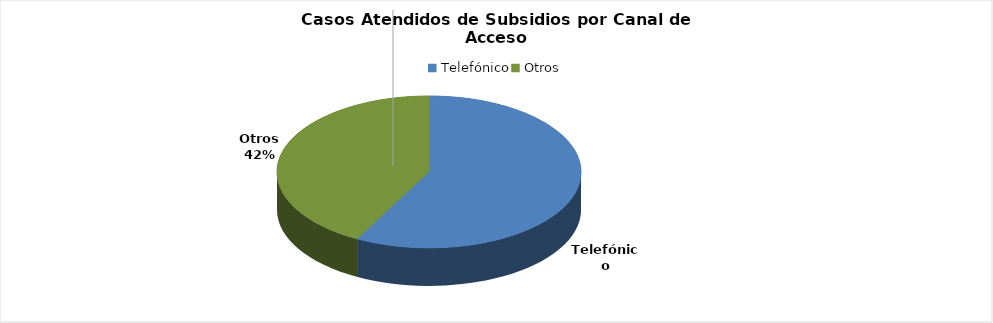
| Category | Total |
|---|---|
| Telefónico | 55865 |
| Otros | 40781 |